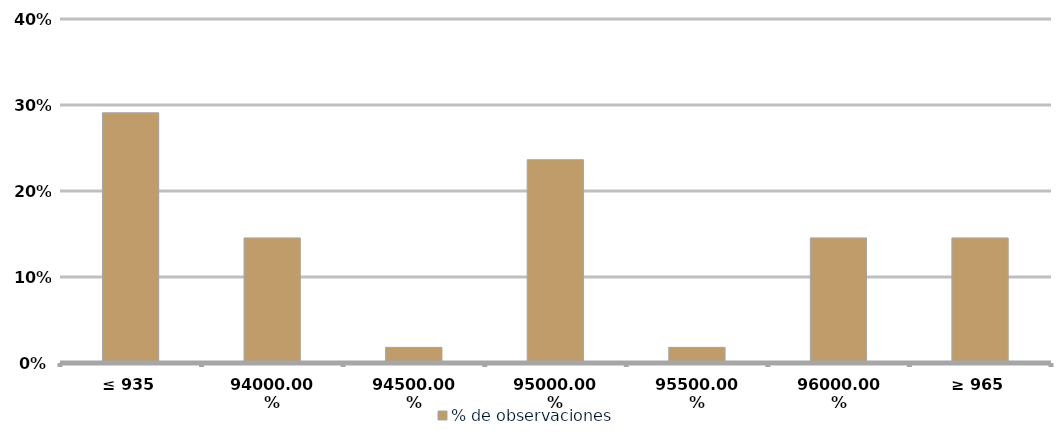
| Category | % de observaciones  |
|---|---|
| ≤ 935 | 0.291 |
| 940 | 0.145 |
| 945 | 0.018 |
| 950 | 0.236 |
| 955 | 0.018 |
| 960 | 0.145 |
| ≥ 965 | 0.145 |